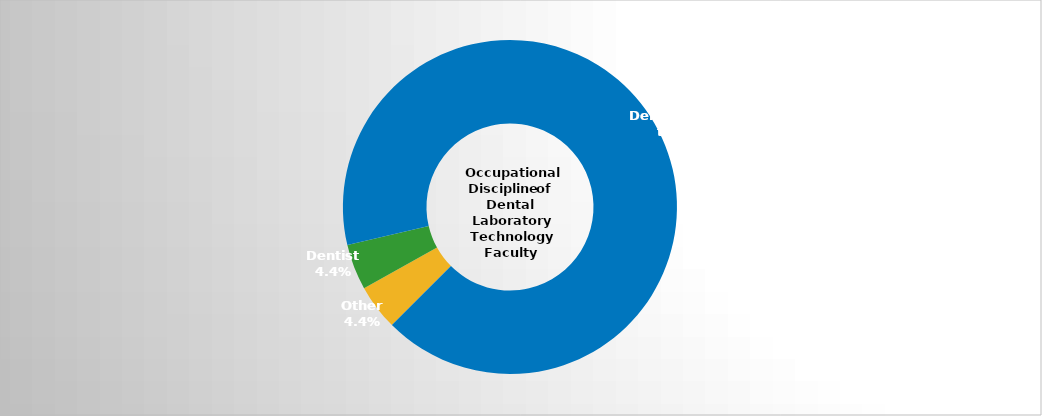
| Category | Series 2 |
|---|---|
| Other | 0.044 |
| Dentist | 0.044 |
| Dental laboratory technician | 0.912 |